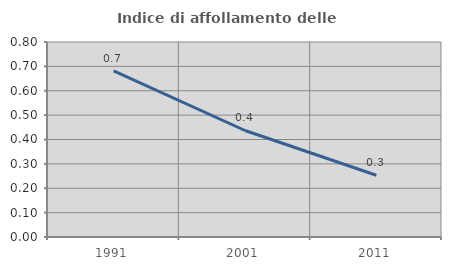
| Category | Indice di affollamento delle abitazioni  |
|---|---|
| 1991.0 | 0.681 |
| 2001.0 | 0.437 |
| 2011.0 | 0.253 |